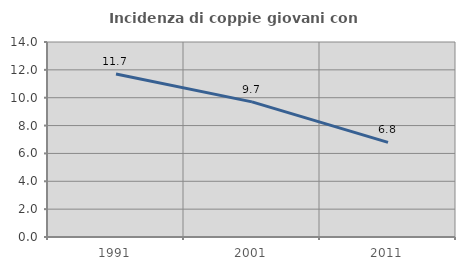
| Category | Incidenza di coppie giovani con figli |
|---|---|
| 1991.0 | 11.706 |
| 2001.0 | 9.701 |
| 2011.0 | 6.796 |